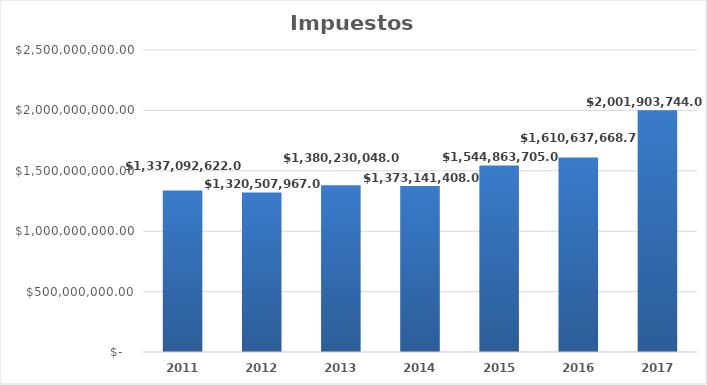
| Category | Impuestos (total) |
|---|---|
| 2011.0 | 1337092622 |
| 2012.0 | 1320507967 |
| 2013.0 | 1380230048 |
| 2014.0 | 1373141408 |
| 2015.0 | 1544863705 |
| 2016.0 | 1610637668.72 |
| 2017.0 | 2001903744 |